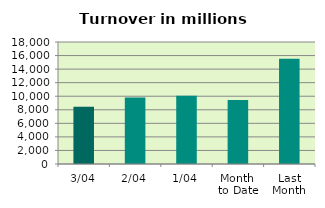
| Category | Series 0 |
|---|---|
| 3/04 | 8443.488 |
| 2/04 | 9801.017 |
| 1/04 | 10084.994 |
| Month 
to Date | 9443.166 |
| Last
Month | 15518.097 |